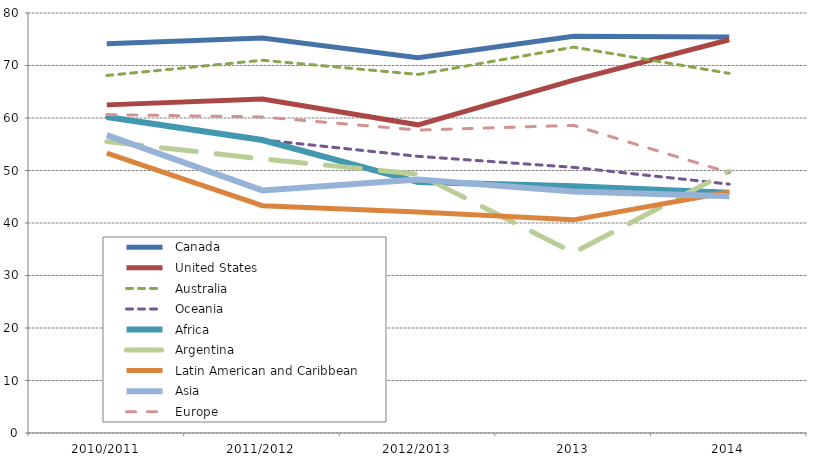
| Category |   Canada |   United States |   Australia |   Oceania |   Africa |   Argentina |   Latin American and Caribbean |   Asia |   Europe |
|---|---|---|---|---|---|---|---|---|---|
| 2010/2011 | 74.15 | 62.5 | 68.1 | 60.1 | 60.2 | 55.5 | 53.3 | 56.75 | 60.65 |
| 2011/2012 | 75.25 | 63.6 | 71 | 55.85 | 55.8 | 52.2 | 43.3 | 46.2 | 60.2 |
| 2012/2013 | 71.5 | 58.7 | 68.3 | 52.7 | 47.8 | 49.3 | 42.1 | 48.3 | 57.7 |
| 2013 | 75.55 | 67.2 | 73.5 | 50.6 | 47 | 34.35 | 40.6 | 46 | 58.6 |
| 2014 | 75.45 | 74.9 | 68.5 | 47.4 | 45.75 | 49.85 | 45.9 | 45.1 | 49.6 |